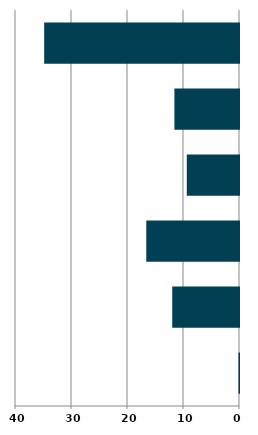
| Category | Series 0 |
|---|---|
| 0 | 0.088 |
| 1 | 11.926 |
| 2 | 16.556 |
| 3 | 9.324 |
| 4 | 11.534 |
| 5 | 34.792 |